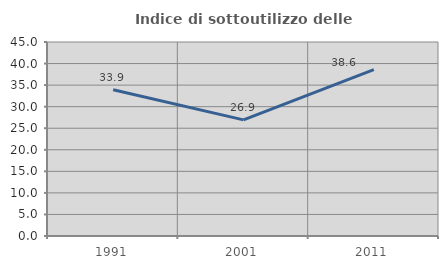
| Category | Indice di sottoutilizzo delle abitazioni  |
|---|---|
| 1991.0 | 33.918 |
| 2001.0 | 26.943 |
| 2011.0 | 38.596 |